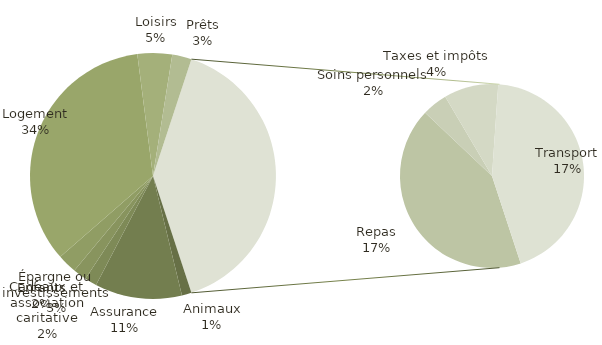
| Category | Total |
|---|---|
| Animaux | 100 |
| Assurance | 900 |
| Cadeaux et association caritative | 125 |
| Enfants | 140 |
| Épargne ou investissements | 200 |
| Logement | 2702 |
| Loisirs | 358 |
| Prêts | 200 |
| Repas | 1320 |
| Soins personnels | 140 |
| Taxes et impôts | 300 |
| Transport | 1375 |